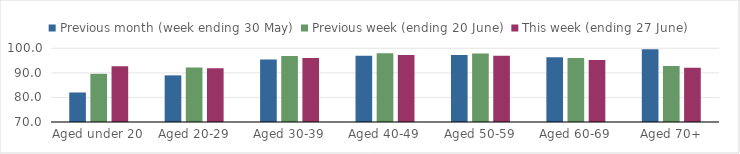
| Category | Previous month (week ending 30 May) | Previous week (ending 20 June) | This week (ending 27 June) |
|---|---|---|---|
| Aged under 20 | 82.013 | 89.607 | 92.668 |
| Aged 20-29 | 88.984 | 92.13 | 91.898 |
| Aged 30-39 | 95.44 | 96.834 | 96.075 |
| Aged 40-49 | 96.993 | 98.004 | 97.308 |
| Aged 50-59 | 97.311 | 97.882 | 97.01 |
| Aged 60-69 | 96.382 | 96.084 | 95.233 |
| Aged 70+ | 99.644 | 92.774 | 92.029 |